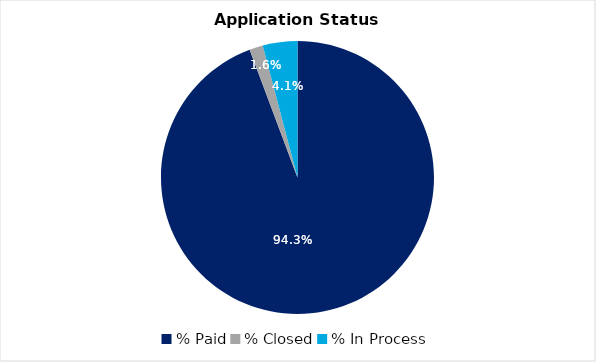
| Category | Series 0 |
|---|---|
| % Paid | 0.943 |
| % Closed | 0.016 |
| % In Process | 0.041 |